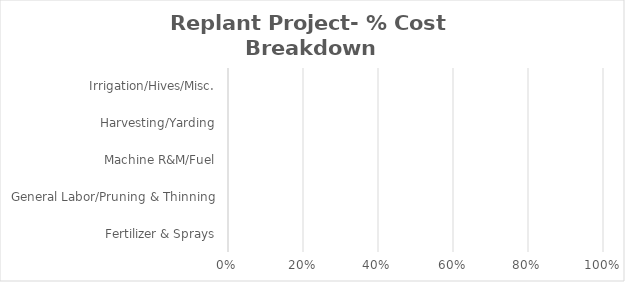
| Category | Series 3 |
|---|---|
| Fertilizer & Sprays | 0 |
| General Labor/Pruning & Thinning | 0 |
| Machine R&M/Fuel | 0 |
| Harvesting/Yarding | 0 |
| Irrigation/Hives/Misc. | 0 |